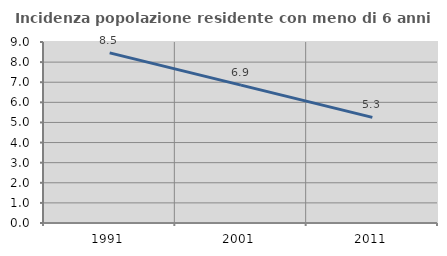
| Category | Incidenza popolazione residente con meno di 6 anni |
|---|---|
| 1991.0 | 8.46 |
| 2001.0 | 6.858 |
| 2011.0 | 5.251 |